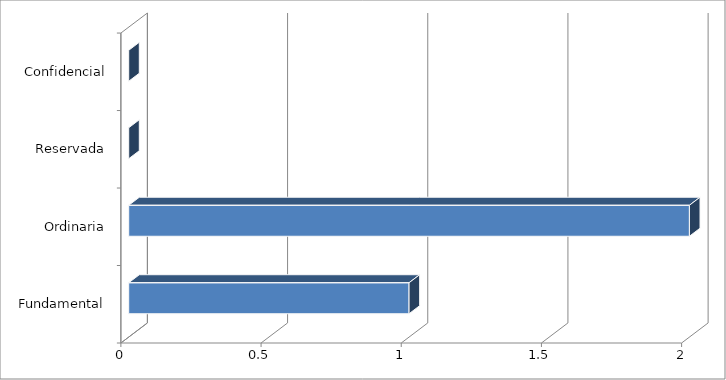
| Category | Series 0 |
|---|---|
| 0 | 1 |
| 1 | 2 |
| 2 | 0 |
| 3 | 0 |